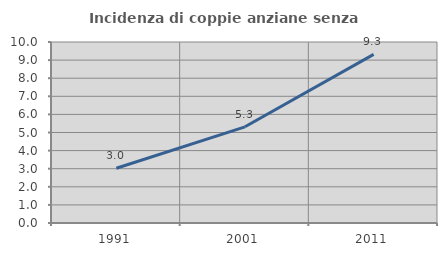
| Category | Incidenza di coppie anziane senza figli  |
|---|---|
| 1991.0 | 3.025 |
| 2001.0 | 5.315 |
| 2011.0 | 9.314 |